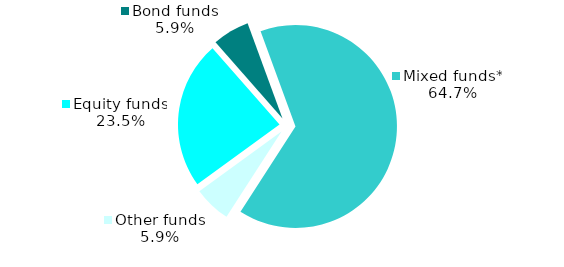
| Category | Series 0 |
|---|---|
| Equity funds | 8 |
| Bond funds | 2 |
| Mixed funds* | 22 |
| Other funds | 2 |